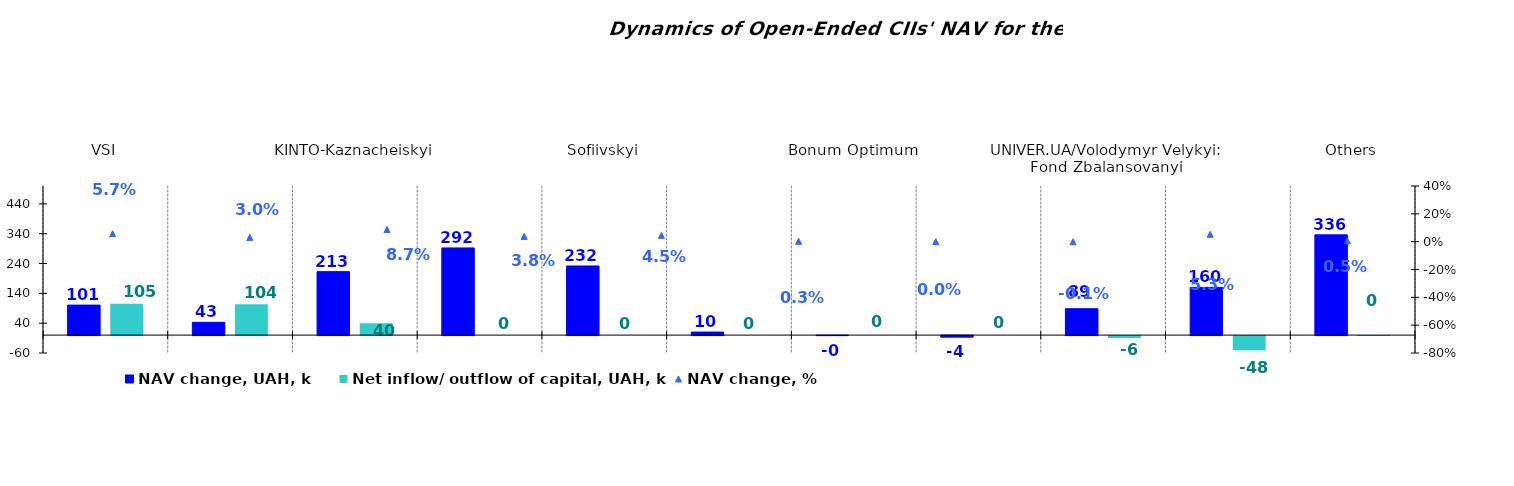
| Category | NAV change, UAH, k | Net inflow/ outflow of capital, UAH, k |
|---|---|---|
| VSI | 100.567 | 104.984 |
| UNIVER.UA/Iaroslav Mudryi: Fond Aktsii | 42.903 | 103.537 |
| KINTO-Kaznacheiskyi | 212.847 | 39.742 |
| UNIVER.UA/Myhailo Hrushevskyi: Fond Derzhavnykh Paperiv | 292.322 | 0 |
| Sofiivskyi | 231.824 | 0 |
| Altus – Zbalansovanyi | 10.107 | 0 |
| Bonum Optimum | -0.02 | 0 |
| Altus – Depozyt | -4.358 | 0 |
| UNIVER.UA/Volodymyr Velykyi: Fond Zbalansovanyi | 88.529 | -6.163 |
| КІNТО-Klasychnyi | 160.051 | -47.64 |
| Others | 336.14 | 0.001 |